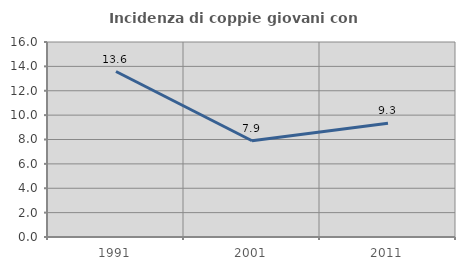
| Category | Incidenza di coppie giovani con figli |
|---|---|
| 1991.0 | 13.578 |
| 2001.0 | 7.895 |
| 2011.0 | 9.339 |